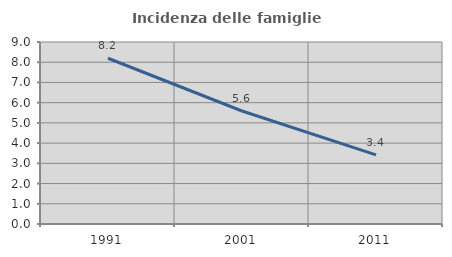
| Category | Incidenza delle famiglie numerose |
|---|---|
| 1991.0 | 8.197 |
| 2001.0 | 5.588 |
| 2011.0 | 3.416 |